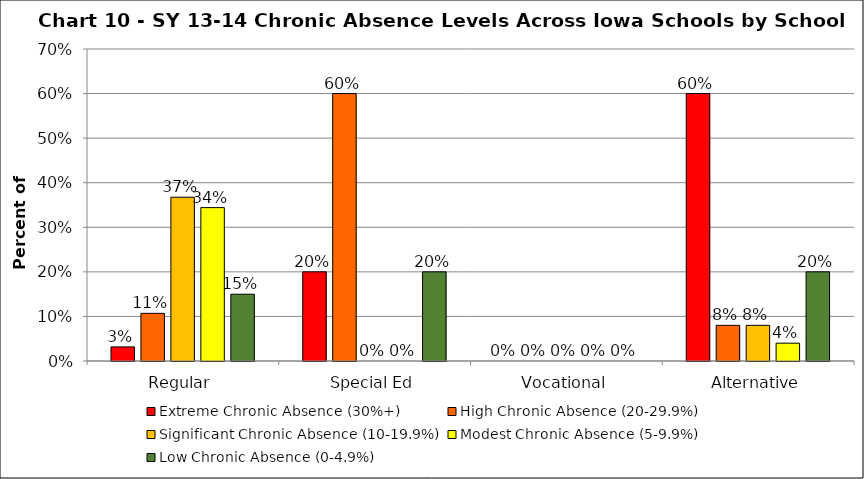
| Category | Extreme Chronic Absence (30%+) | High Chronic Absence (20-29.9%) | Significant Chronic Absence (10-19.9%) | Modest Chronic Absence (5-9.9%) | Low Chronic Absence (0-4.9%) |
|---|---|---|---|---|---|
| 0 | 0.032 | 0.107 | 0.367 | 0.344 | 0.15 |
| 1 | 0.2 | 0.6 | 0 | 0 | 0.2 |
| 2 | 0 | 0 | 0 | 0 | 0 |
| 3 | 0.6 | 0.08 | 0.08 | 0.04 | 0.2 |